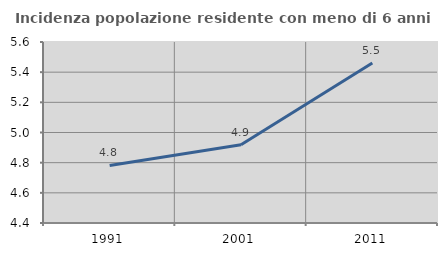
| Category | Incidenza popolazione residente con meno di 6 anni |
|---|---|
| 1991.0 | 4.781 |
| 2001.0 | 4.919 |
| 2011.0 | 5.461 |